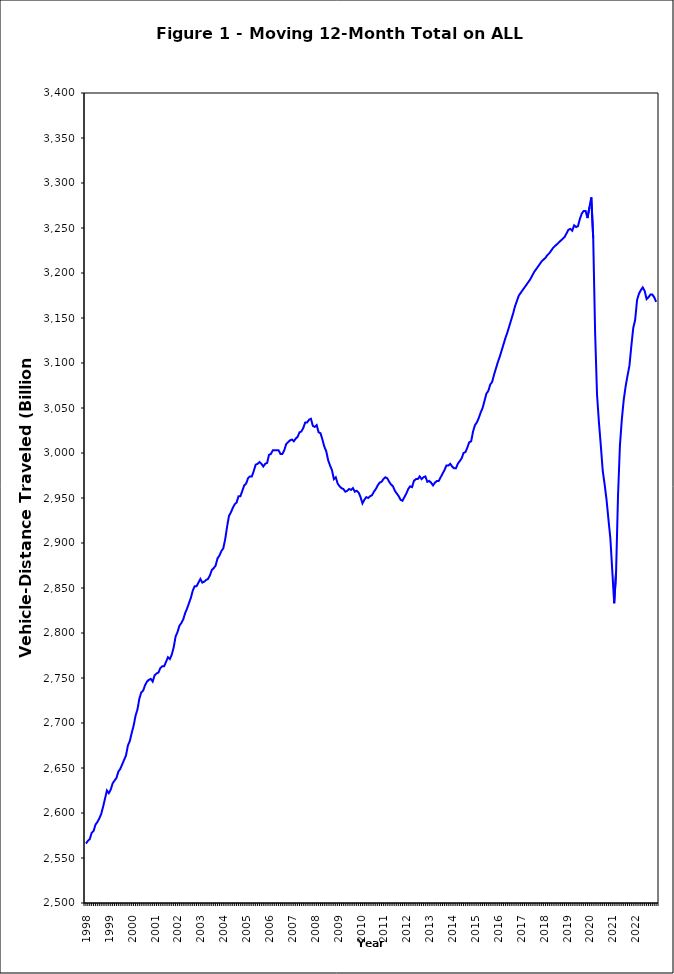
| Category | Annual Vehicle-Distance Traveled (Billion Miles) |
|---|---|
| 1998 | 2566 |
| 1998 | 2569 |
| 1998 | 2571 |
| 1998 | 2578 |
| 1998 | 2580 |
| 1998 | 2587 |
| 1998 | 2590 |
| 1998 | 2594 |
| 1998 | 2599 |
| 1998 | 2607 |
| 1998 | 2616 |
| 1998 | 2625 |
| 1999 | 2622 |
| 1999 | 2626 |
| 1999 | 2633 |
| 1999 | 2636 |
| 1999 | 2639 |
| 1999 | 2646 |
| 1999 | 2649 |
| 1999 | 2654 |
| 1999 | 2659 |
| 1999 | 2664 |
| 1999 | 2675 |
| 1999 | 2680 |
| 2000 | 2689 |
| 2000 | 2697 |
| 2000 | 2708 |
| 2000 | 2715 |
| 2000 | 2727 |
| 2000 | 2734 |
| 2000 | 2736 |
| 2000 | 2742 |
| 2000 | 2746 |
| 2000 | 2748 |
| 2000 | 2749 |
| 2000 | 2746 |
| 2001 | 2753 |
| 2001 | 2755 |
| 2001 | 2756 |
| 2001 | 2761 |
| 2001 | 2763 |
| 2001 | 2763 |
| 2001 | 2768 |
| 2001 | 2773 |
| 2001 | 2771 |
| 2001 | 2776 |
| 2001 | 2784 |
| 2001 | 2796 |
| 2002 | 2801 |
| 2002 | 2808 |
| 2002 | 2811 |
| 2002 | 2815 |
| 2002 | 2822 |
| 2002 | 2827 |
| 2002 | 2833 |
| 2002 | 2839 |
| 2002 | 2847 |
| 2002 | 2852 |
| 2002 | 2852 |
| 2002 | 2856 |
| 2003 | 2860 |
| 2003 | 2856 |
| 2003 | 2857 |
| 2003 | 2859 |
| 2003 | 2860 |
| 2003 | 2864 |
| 2003 | 2870 |
| 2003 | 2872 |
| 2003 | 2875 |
| 2003 | 2883 |
| 2003 | 2886 |
| 2003 | 2891 |
| 2004 | 2894 |
| 2004 | 2904 |
| 2004 | 2918 |
| 2004 | 2930 |
| 2004 | 2934 |
| 2004 | 2939 |
| 2004 | 2943 |
| 2004 | 2945 |
| 2004 | 2952 |
| 2004 | 2952 |
| 2004 | 2958 |
| 2004 | 2964 |
| 2005 | 2966 |
| 2005 | 2972 |
| 2005 | 2974 |
| 2005 | 2974 |
| 2005 | 2980 |
| 2005 | 2987 |
| 2005 | 2988 |
| 2005 | 2990 |
| 2005 | 2988 |
| 2005 | 2985 |
| 2005 | 2988 |
| 2005 | 2989 |
| 2006 | 2998 |
| 2006 | 2999 |
| 2006 | 3003 |
| 2006 | 3003 |
| 2006 | 3003 |
| 2006 | 3003 |
| 2006 | 2999 |
| 2006 | 2999 |
| 2006 | 3003 |
| 2006 | 3010 |
| 2006 | 3012 |
| 2006 | 3014 |
| 2007 | 3015 |
| 2007 | 3013 |
| 2007 | 3016 |
| 2007 | 3018 |
| 2007 | 3023 |
| 2007 | 3024 |
| 2007 | 3028 |
| 2007 | 3034 |
| 2007 | 3034 |
| 2007 | 3037 |
| 2007 | 3038 |
| 2007 | 3030 |
| 2008 | 3029 |
| 2008 | 3031 |
| 2008 | 3023 |
| 2008 | 3022 |
| 2008 | 3015 |
| 2008 | 3007 |
| 2008 | 3002 |
| 2008 | 2992 |
| 2008 | 2986 |
| 2008 | 2981 |
| 2008 | 2971 |
| 2008 | 2973 |
| 2009 | 2966 |
| 2009 | 2963 |
| 2009 | 2961 |
| 2009 | 2960 |
| 2009 | 2957 |
| 2009 | 2958 |
| 2009 | 2960 |
| 2009 | 2959 |
| 2009 | 2961 |
| 2009 | 2957 |
| 2009 | 2958 |
| 2009 | 2956 |
| 2010 | 2951 |
| 2010 | 2944 |
| 2010 | 2948 |
| 2010 | 2951 |
| 2010 | 2950 |
| 2010 | 2952 |
| 2010 | 2953 |
| 2010 | 2957 |
| 2010 | 2960 |
| 2010 | 2964 |
| 2010 | 2967 |
| 2010 | 2968 |
| 2011 | 2971 |
| 2011 | 2973 |
| 2011 | 2972 |
| 2011 | 2968 |
| 2011 | 2965 |
| 2011 | 2963 |
| 2011 | 2958 |
| 2011 | 2955 |
| 2011 | 2952 |
| 2011 | 2948 |
| 2011 | 2947 |
| 2011 | 2951 |
| 2012 | 2955 |
| 2012 | 2960 |
| 2012 | 2963 |
| 2012 | 2962 |
| 2012 | 2969 |
| 2012 | 2971 |
| 2012 | 2971 |
| 2012 | 2974 |
| 2012 | 2971 |
| 2012 | 2973 |
| 2012 | 2974 |
| 2012 | 2968 |
| 2013 | 2969 |
| 2013 | 2967 |
| 2013 | 2964 |
| 2013 | 2967 |
| 2013 | 2969 |
| 2013 | 2969 |
| 2013 | 2973 |
| 2013 | 2977 |
| 2013 | 2981 |
| 2013 | 2986 |
| 2013 | 2986 |
| 2013 | 2988 |
| 2014 | 2985 |
| 2014 | 2983 |
| 2014 | 2983 |
| 2014 | 2988 |
| 2014 | 2991 |
| 2014 | 2994 |
| 2014 | 3000 |
| 2014 | 3001 |
| 2014 | 3006 |
| 2014 | 3012 |
| 2014 | 3013 |
| 2014 | 3024 |
| 2015 | 3031 |
| 2015 | 3034 |
| 2015 | 3039 |
| 2015 | 3045 |
| 2015 | 3050 |
| 2015 | 3058 |
| 2015 | 3066 |
| 2015 | 3069 |
| 2015 | 3076 |
| 2015 | 3079 |
| 2015 | 3087 |
| 2015 | 3094 |
| 2016 | 3101 |
| 2016 | 3107 |
| 2016 | 3114 |
| 2016 | 3121 |
| 2016 | 3128 |
| 2016 | 3134 |
| 2016 | 3141 |
| 2016 | 3148 |
| 2016 | 3155 |
| 2016 | 3163 |
| 2016 | 3169 |
| 2016 | 3175 |
| 2017 | 3178 |
| 2017 | 3181 |
| 2017 | 3184 |
| 2017 | 3187 |
| 2017 | 3190 |
| 2017 | 3193 |
| 2017 | 3197 |
| 2017 | 3201 |
| 2017 | 3204 |
| 2017 | 3207 |
| 2017 | 3210 |
| 2017 | 3213 |
| 2018 | 3215 |
| 2018 | 3217 |
| 2018 | 3220 |
| 2018 | 3222 |
| 2018 | 3225 |
| 2018 | 3228 |
| 2018 | 3230 |
| 2018 | 3232 |
| 2018 | 3234 |
| 2018 | 3236 |
| 2018 | 3238 |
| 2018 | 3240 |
| 2019 | 3244 |
| 2019 | 3248 |
| 2019 | 3249 |
| 2019 | 3247 |
| 2019 | 3253 |
| 2019 | 3251 |
| 2019 | 3252 |
| 2019 | 3260 |
| 2019 | 3266 |
| 2019 | 3269 |
| 2019 | 3269 |
| 2019 | 3261 |
| 2020 | 3273 |
| 2020 | 3284 |
| 2020 | 3239 |
| 2020 | 3134 |
| 2020 | 3065 |
| 2020 | 3034 |
| 2020 | 3008 |
| 2020 | 2980 |
| 2020 | 2965 |
| 2020 | 2948 |
| 2020 | 2926 |
| 2020 | 2905 |
| 2021 | 2869 |
| 2021 | 2833 |
| 2021 | 2868 |
| 2021 | 2952 |
| 2021 | 3008 |
| 2021 | 3037 |
| 2021 | 3059 |
| 2021 | 3074 |
| 2021 | 3086 |
| 2021 | 3097 |
| 2021 | 3119 |
| 2021 | 3139 |
| 2022 | 3148 |
| 2022 | 3170 |
| 2022 | 3177 |
| 2022 | 3181 |
| 2022 | 3184 |
| 2022 | 3180 |
| 2022 | 3171 |
| 2022 | 3173 |
| 2022 | 3176 |
| 2022 | 3176 |
| 2022 | 3173 |
| 2022 | 3168 |